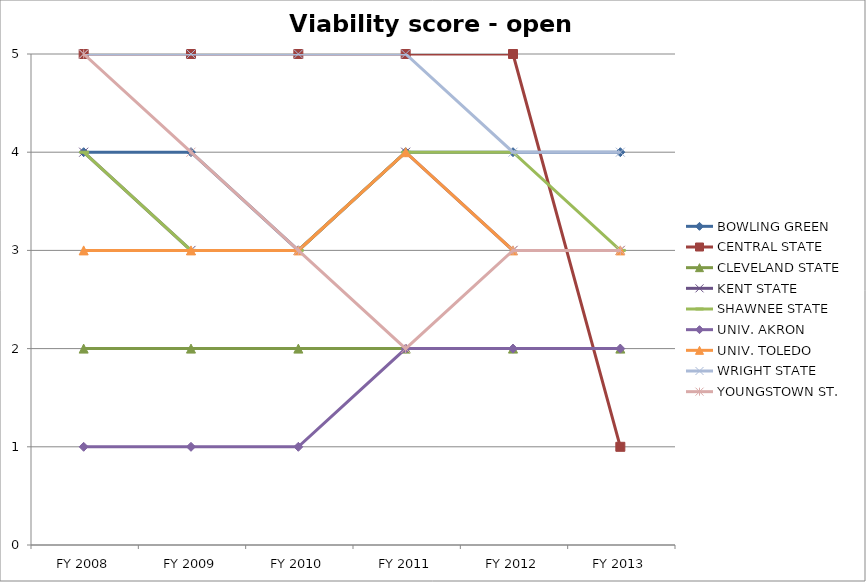
| Category | BOWLING GREEN  | CENTRAL STATE  | CLEVELAND STATE  | KENT STATE  | SHAWNEE STATE  | UNIV. AKRON  | UNIV. TOLEDO  | WRIGHT STATE  | YOUNGSTOWN ST.  |
|---|---|---|---|---|---|---|---|---|---|
| FY 2013 | 4 | 1 | 2 | 3 | 3 | 2 | 3 | 4 | 3 |
| FY 2012 | 4 | 5 | 2 | 3 | 4 | 2 | 3 | 4 | 3 |
| FY 2011 | 4 | 5 | 2 | 4 | 4 | 2 | 4 | 5 | 2 |
| FY 2010 | 3 | 5 | 2 | 3 | 3 | 1 | 3 | 5 | 3 |
| FY 2009 | 4 | 5 | 2 | 3 | 3 | 1 | 3 | 5 | 4 |
| FY 2008 | 4 | 5 | 2 | 4 | 4 | 1 | 3 | 5 | 5 |